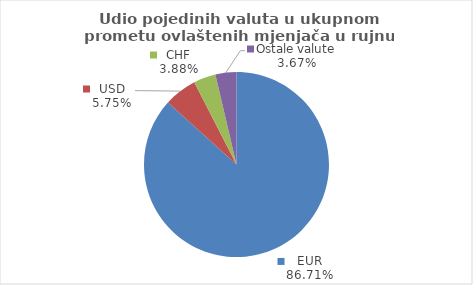
| Category | Series 0 |
|---|---|
| EUR | 86.71 |
| USD | 5.749 |
| CHF | 3.872 |
| Ostale valute | 3.669 |